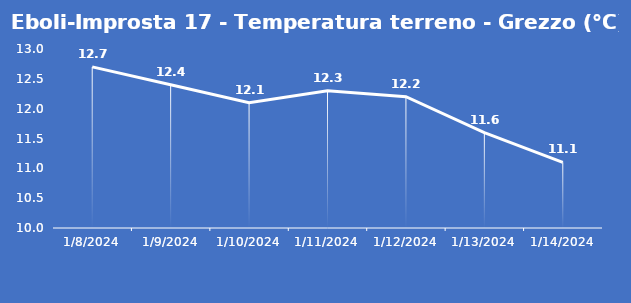
| Category | Eboli-Improsta 17 - Temperatura terreno - Grezzo (°C) |
|---|---|
| 1/8/24 | 12.7 |
| 1/9/24 | 12.4 |
| 1/10/24 | 12.1 |
| 1/11/24 | 12.3 |
| 1/12/24 | 12.2 |
| 1/13/24 | 11.6 |
| 1/14/24 | 11.1 |